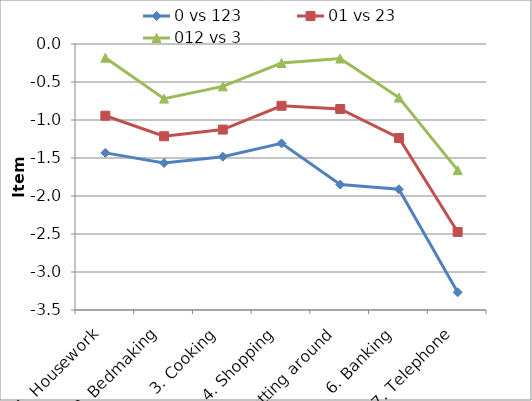
| Category | 0 vs 123 | 01 vs 23 | 012 vs 3 |
|---|---|---|---|
| 1. Housework | -1.433 | -0.944 | -0.181 |
| 2. Bedmaking | -1.566 | -1.214 | -0.719 |
| 3. Cooking | -1.483 | -1.126 | -0.558 |
| 4. Shopping | -1.307 | -0.813 | -0.25 |
| 5. Getting around | -1.85 | -0.855 | -0.192 |
| 6. Banking | -1.912 | -1.237 | -0.706 |
| 7. Telephone | -3.268 | -2.474 | -1.66 |